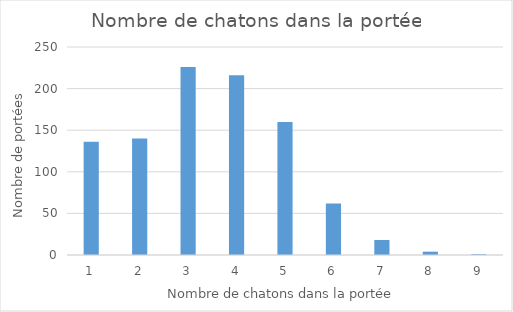
| Category | Series 0 |
|---|---|
| 1.0 | 136 |
| 2.0 | 140 |
| 3.0 | 226 |
| 4.0 | 216 |
| 5.0 | 160 |
| 6.0 | 62 |
| 7.0 | 18 |
| 8.0 | 4 |
| 9.0 | 1 |